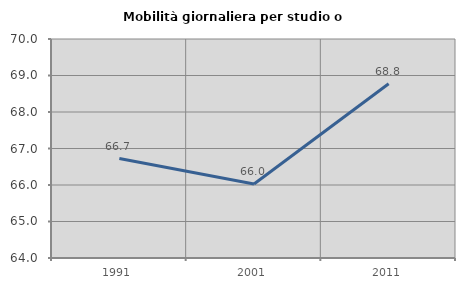
| Category | Mobilità giornaliera per studio o lavoro |
|---|---|
| 1991.0 | 66.724 |
| 2001.0 | 66.029 |
| 2011.0 | 68.775 |